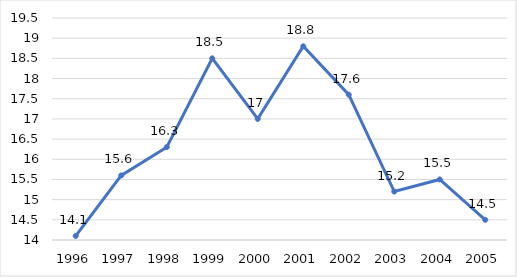
| Category | Coeficiente de penetração das importações |
|---|---|
| 1996.0 | 14.1 |
| 1997.0 | 15.6 |
| 1998.0 | 16.3 |
| 1999.0 | 18.5 |
| 2000.0 | 17 |
| 2001.0 | 18.8 |
| 2002.0 | 17.6 |
| 2003.0 | 15.2 |
| 2004.0 | 15.5 |
| 2005.0 | 14.5 |